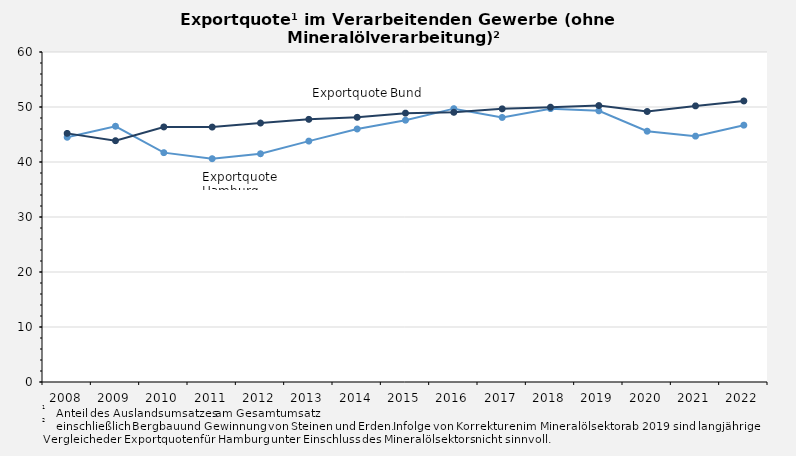
| Category | Exportquote Hamburg | Exportquote Bund |
|---|---|---|
| 2008.0 | 44.5 | 45.205 |
| 2009.0 | 46.5 | 43.874 |
| 2010.0 | 41.7 | 46.374 |
| 2011.0 | 40.6 | 46.35 |
| 2012.0 | 41.5 | 47.082 |
| 2013.0 | 43.8 | 47.753 |
| 2014.0 | 46 | 48.123 |
| 2015.0 | 47.6 | 48.885 |
| 2016.0 | 49.7 | 49.034 |
| 2017.0 | 48.1 | 49.662 |
| 2018.0 | 49.7 | 49.968 |
| 2019.0 | 49.3 | 50.264 |
| 2020.0 | 45.6 | 49.181 |
| 2021.0 | 44.7 | 50.2 |
| 2022.0 | 46.7 | 51.1 |